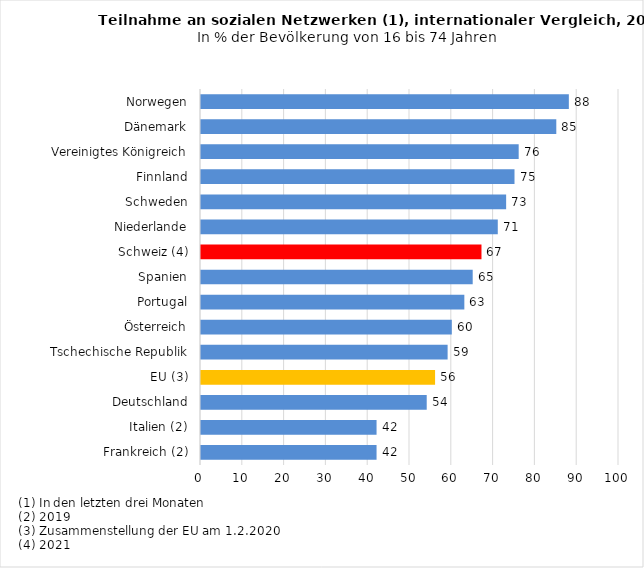
| Category | 2020 |
|---|---|
| Frankreich (2) | 42 |
| Italien (2) | 42 |
| Deutschland | 54 |
| EU (3) | 56 |
| Tschechische Republik | 59 |
| Österreich | 60 |
| Portugal | 63 |
| Spanien | 65 |
| Schweiz (4) | 67.102 |
| Niederlande | 71 |
| Schweden | 73 |
| Finnland | 75 |
| Vereinigtes Königreich | 76 |
| Dänemark | 85 |
| Norwegen | 88 |